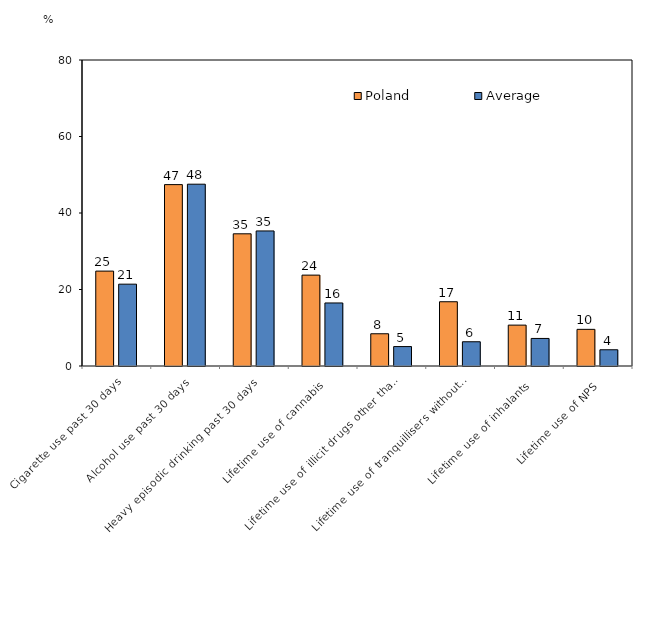
| Category | Poland | Average |
|---|---|---|
| Cigarette use past 30 days | 24.81 | 21.397 |
| Alcohol use past 30 days | 47.42 | 47.531 |
| Heavy episodic drinking past 30 days | 34.56 | 35.309 |
| Lifetime use of cannabis | 23.76 | 16.48 |
| Lifetime use of illicit drugs other than cannabis | 8.43 | 5.079 |
| Lifetime use of tranquillisers without prescription  | 16.8 | 6.34 |
| Lifetime use of inhalants | 10.69 | 7.202 |
| Lifetime use of NPS | 9.58 | 4.246 |